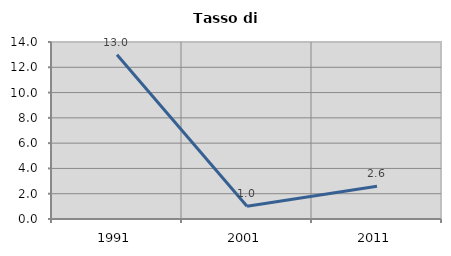
| Category | Tasso di disoccupazione   |
|---|---|
| 1991.0 | 12.987 |
| 2001.0 | 1.01 |
| 2011.0 | 2.586 |